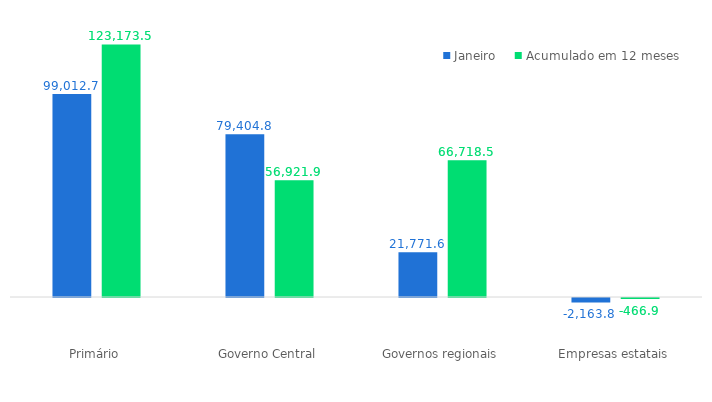
| Category | Janeiro | Acumulado em 12 meses |
|---|---|---|
| Primário | 99012.697 | 123173.482 |
| Governo Central | 79404.82 | 56921.941 |
| Governos regionais | 21771.64 | 66718.479 |
| Empresas estatais | -2163.762 | -466.937 |